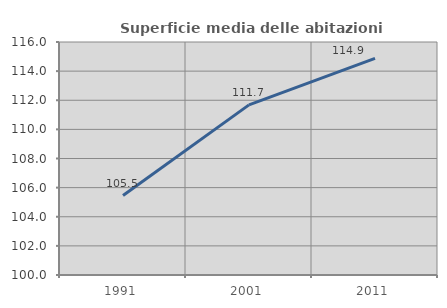
| Category | Superficie media delle abitazioni occupate |
|---|---|
| 1991.0 | 105.457 |
| 2001.0 | 111.683 |
| 2011.0 | 114.869 |